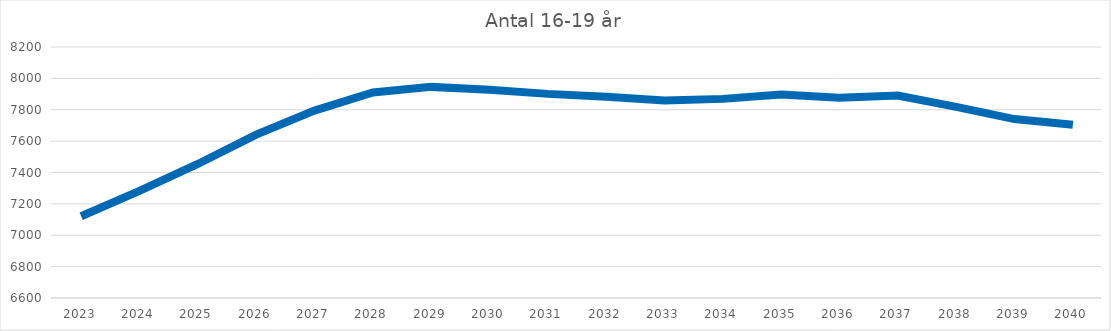
| Category | Antal 16-19 år |
|---|---|
| 2023.0 | 7121 |
| 2024.0 | 7282.578 |
| 2025.0 | 7454.239 |
| 2026.0 | 7641.788 |
| 2027.0 | 7794.588 |
| 2028.0 | 7910.572 |
| 2029.0 | 7945.776 |
| 2030.0 | 7927.225 |
| 2031.0 | 7901.198 |
| 2032.0 | 7883.547 |
| 2033.0 | 7858.28 |
| 2034.0 | 7869.326 |
| 2035.0 | 7897.79 |
| 2036.0 | 7876.865 |
| 2037.0 | 7890.909 |
| 2038.0 | 7818.659 |
| 2039.0 | 7740.761 |
| 2040.0 | 7704.512 |